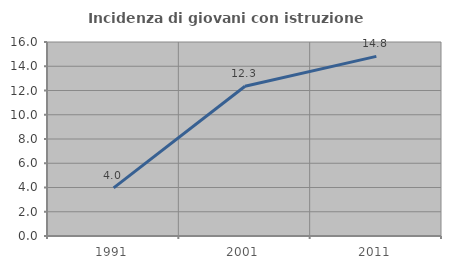
| Category | Incidenza di giovani con istruzione universitaria |
|---|---|
| 1991.0 | 3.968 |
| 2001.0 | 12.346 |
| 2011.0 | 14.815 |